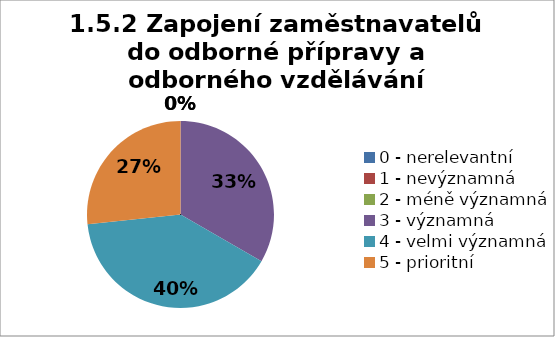
| Category | Series 0 |
|---|---|
| 0 - nerelevantní | 0 |
| 1 - nevýznamná | 0 |
| 2 - méně významná | 0 |
| 3 - významná | 33.333 |
| 4 - velmi významná | 40 |
| 5 - prioritní | 26.667 |